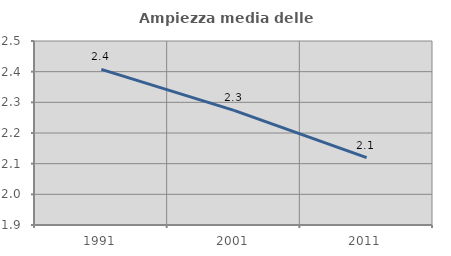
| Category | Ampiezza media delle famiglie |
|---|---|
| 1991.0 | 2.408 |
| 2001.0 | 2.274 |
| 2011.0 | 2.12 |